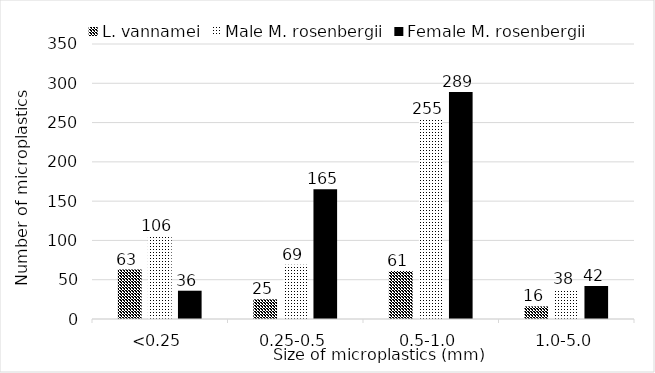
| Category | L. vannamei | Male M. rosenbergii | Female M. rosenbergii |
|---|---|---|---|
| <0.25 | 63 | 106 | 36 |
| 0.25-0.5 | 25 | 69 | 165 |
| 0.5-1.0 | 61 | 255 | 289 |
| 1.0-5.0 | 16 | 38 | 42 |